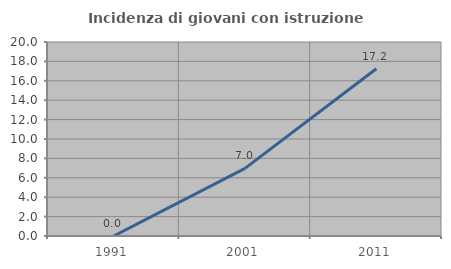
| Category | Incidenza di giovani con istruzione universitaria |
|---|---|
| 1991.0 | 0 |
| 2001.0 | 6.977 |
| 2011.0 | 17.241 |